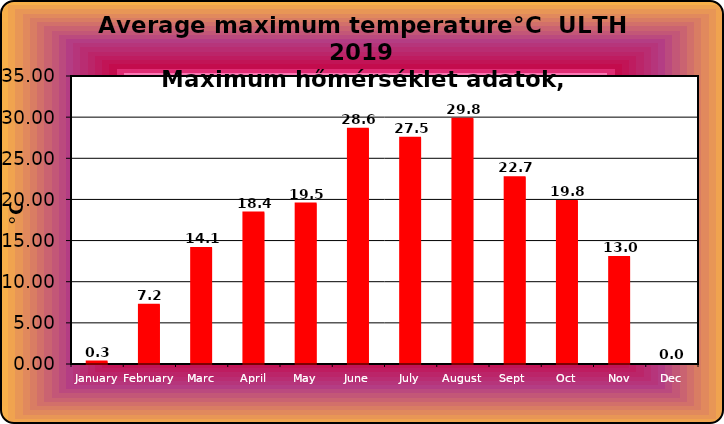
| Category | Series 0 |
|---|---|
| January | 0.3 |
| February | 7.2 |
| Marc | 14.1 |
| April | 18.4 |
| May | 19.5 |
| June | 28.6 |
| July | 27.5 |
| August | 29.8 |
| Sept  | 22.7 |
| Oct | 19.8 |
| Nov | 13 |
| Dec | 0 |